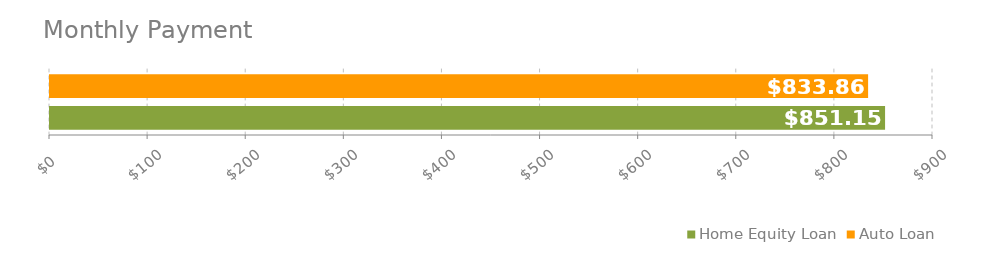
| Category | Home Equity Loan | Auto Loan |
|---|---|---|
| Monthly payment | 851.15 | 833.86 |